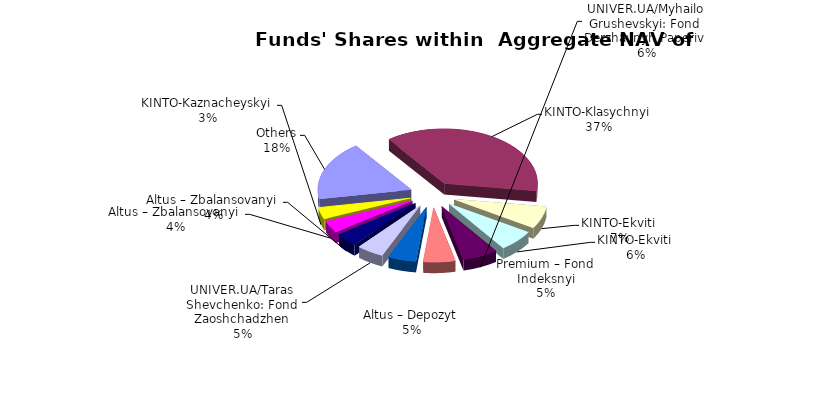
| Category | Series 0 | Series 1 |
|---|---|---|
| Others | 10355174.532 | 0.172 |
| KINTO-Klasychnyi | 21828061.32 | 0.362 |
| KINTO-Ekviti | 3879536.51 | 0.064 |
| KINTO-Ekviti | 3699167 | 0.061 |
| UNIVER.UA/Myhailo Grushevskyi: Fond Derzhavnyh Paperiv | 3602007.55 | 0.06 |
| Premium – Fond Indeksnyi | 3218439.204 | 0.053 |
| Altus – Depozyt | 2845799.98 | 0.047 |
| UNIVER.UA/Taras Shevchenko: Fond Zaoshchadzhen | 2739340.96 | 0.045 |
| Altus – Zbalansovanyi | 2311239.83 | 0.038 |
| Altus – Zbalansovanyi | 2052153.93 | 0.034 |
| KINTO-Kaznacheyskyi | 2014739.69 | 0.033 |